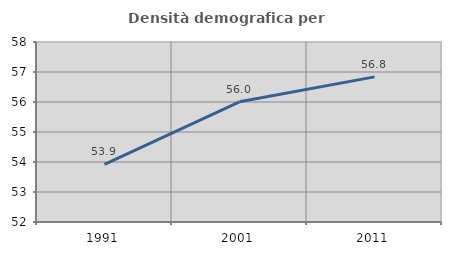
| Category | Densità demografica |
|---|---|
| 1991.0 | 53.918 |
| 2001.0 | 56.007 |
| 2011.0 | 56.838 |